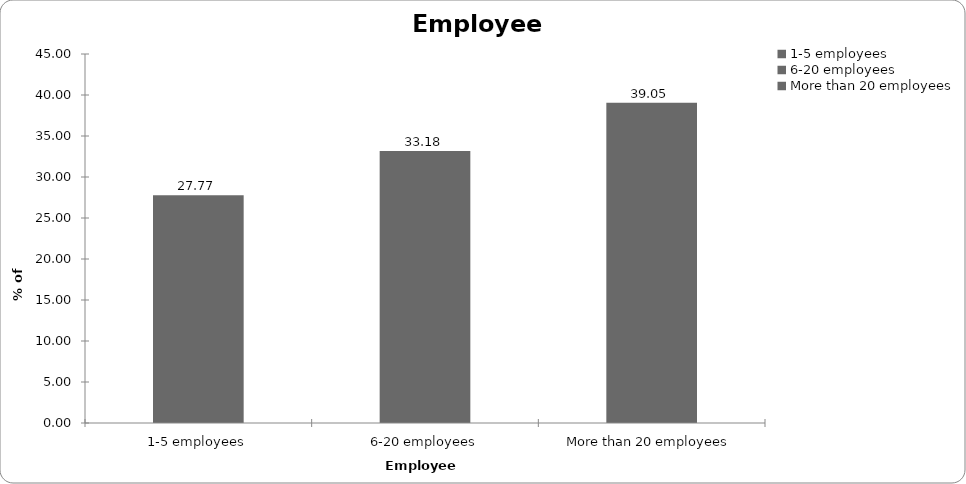
| Category | Employees |
|---|---|
| 1-5 employees | 27.77 |
| 6-20 employees | 33.178 |
| More than 20 employees | 39.052 |